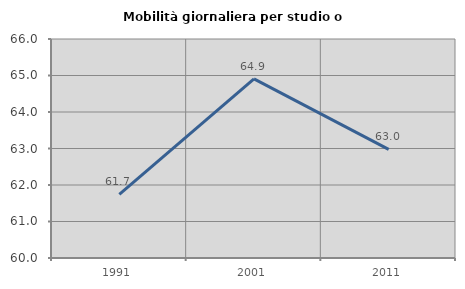
| Category | Mobilità giornaliera per studio o lavoro |
|---|---|
| 1991.0 | 61.743 |
| 2001.0 | 64.907 |
| 2011.0 | 62.975 |